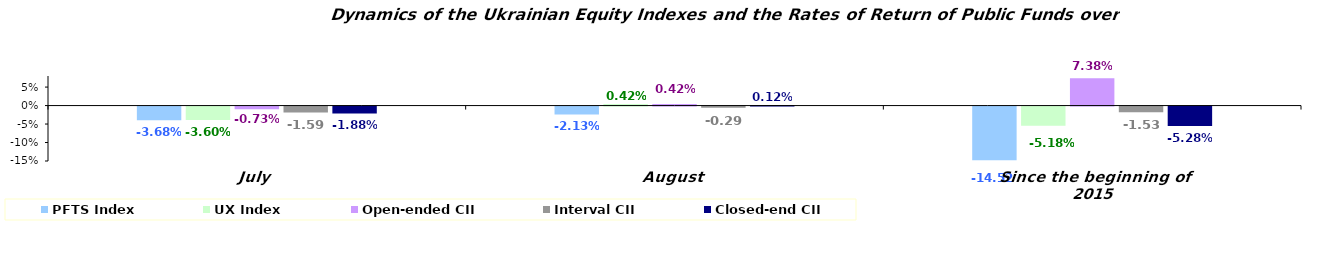
| Category | PFTS Index | UX Index | Open-ended CII | Interval CII | Closed-end CII |
|---|---|---|---|---|---|
| July | -0.037 | -0.036 | -0.007 | -0.016 | -0.019 |
| August | -0.021 | 0.004 | 0.004 | -0.003 | 0.001 |
| Since the beginning of 2015 | -0.145 | -0.052 | 0.074 | -0.015 | -0.053 |